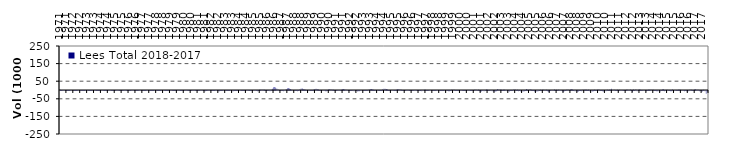
| Category | Lees Total 2018-2017 |
|---|---|
| 1971-01-31 23:59:00 | 2089.157 |
| 1971-02-28 23:59:00 | 69.414 |
| 1971-03-31 23:59:00 | 12.94 |
| 1971-04-30 23:59:00 | -39.855 |
| 1971-05-31 23:59:00 | -316.012 |
| 1971-06-30 23:59:00 | -532.731 |
| 1971-07-31 23:59:00 | -485.225 |
| 1971-08-31 23:59:00 | -167.346 |
| 1971-09-30 23:59:00 | -23.739 |
| 1971-10-31 23:59:00 | 181.066 |
| 1971-11-30 23:59:00 | 168.903 |
| 1971-12-31 23:59:00 | 235.752 |
| 1972-01-31 23:59:00 | 118.074 |
| 1972-02-29 23:59:00 | 70.713 |
| 1972-03-31 23:59:00 | 13.915 |
| 1972-04-30 23:59:00 | -31.402 |
| 1972-05-31 23:59:00 | -270.612 |
| 1972-06-30 23:59:00 | -466.446 |
| 1972-07-31 23:59:00 | -454.354 |
| 1972-08-31 23:59:00 | -190.957 |
| 1972-09-30 23:59:00 | -65.923 |
| 1972-10-31 23:59:00 | 187.51 |
| 1972-11-30 23:59:00 | 195.661 |
| 1972-12-31 23:59:00 | 262.358 |
| 1973-01-31 23:59:00 | 146.51 |
| 1973-02-28 23:59:00 | 106.974 |
| 1973-03-31 23:59:00 | 83.573 |
| 1973-04-30 23:59:00 | 36.99 |
| 1973-05-31 23:59:00 | -180.782 |
| 1973-06-30 23:59:00 | -282.298 |
| 1973-07-31 23:59:00 | -191.907 |
| 1973-08-31 23:59:00 | 78.103 |
| 1973-09-30 23:59:00 | 163.461 |
| 1973-10-31 23:59:00 | 299.173 |
| 1973-11-30 23:59:00 | 222.991 |
| 1973-12-31 23:59:00 | 274.464 |
| 1974-01-31 23:59:00 | 159.395 |
| 1974-02-28 23:59:00 | 113.206 |
| 1974-03-31 23:59:00 | 87.836 |
| 1974-04-30 23:59:00 | 62.555 |
| 1974-05-31 23:59:00 | -156.722 |
| 1974-06-30 23:59:00 | -355.595 |
| 1974-07-31 23:59:00 | -347.822 |
| 1974-08-31 23:59:00 | -19.925 |
| 1974-09-30 23:59:00 | 35.246 |
| 1974-10-31 23:59:00 | -126.607 |
| 1974-11-30 23:59:00 | -348.848 |
| 1974-12-31 23:59:00 | 62.664 |
| 1975-01-31 23:59:00 | 114.846 |
| 1975-02-28 23:59:00 | 67.077 |
| 1975-03-31 23:59:00 | 3.674 |
| 1975-04-30 23:59:00 | -67.404 |
| 1975-05-31 23:59:00 | -278.035 |
| 1975-06-30 23:59:00 | -310.409 |
| 1975-07-31 23:59:00 | -198.966 |
| 1975-08-31 23:59:00 | 73.88 |
| 1975-09-30 23:59:00 | 155.935 |
| 1975-10-31 23:59:00 | 287.997 |
| 1975-11-30 23:59:00 | 211.728 |
| 1975-12-31 23:59:00 | 270.113 |
| 1976-01-31 23:59:00 | 133.889 |
| 1976-02-29 23:59:00 | 107.571 |
| 1976-03-31 23:59:00 | 92.967 |
| 1976-04-30 23:59:00 | 92.132 |
| 1976-05-31 23:59:00 | -16.385 |
| 1976-06-30 23:59:00 | -68.67 |
| 1976-07-31 23:59:00 | -26.881 |
| 1976-08-31 23:59:00 | 126.55 |
| 1976-09-30 23:59:00 | 166.23 |
| 1976-10-31 23:59:00 | 177.496 |
| 1976-11-30 23:59:00 | 154.364 |
| 1976-12-31 23:59:00 | 211.756 |
| 1977-01-31 23:59:00 | 111.117 |
| 1977-02-28 23:59:00 | 69.444 |
| 1977-03-31 23:59:00 | -4.616 |
| 1977-04-30 23:59:00 | -77.29 |
| 1977-05-31 23:59:00 | -335.211 |
| 1977-06-30 23:59:00 | -490.312 |
| 1977-07-31 23:59:00 | -439.468 |
| 1977-08-31 23:59:00 | -134.497 |
| 1977-09-30 23:59:00 | 10.923 |
| 1977-10-31 23:59:00 | 196.837 |
| 1977-11-30 23:59:00 | 171.528 |
| 1977-12-31 23:59:00 | 236.837 |
| 1978-01-31 23:59:00 | 125.286 |
| 1978-02-28 23:59:00 | 78.055 |
| 1978-03-31 23:59:00 | -8.82 |
| 1978-04-30 23:59:00 | -92.59 |
| 1978-05-31 23:59:00 | -374.798 |
| 1978-06-30 23:59:00 | -551.161 |
| 1978-07-31 23:59:00 | -510.447 |
| 1978-08-31 23:59:00 | -168.956 |
| 1978-09-30 23:59:00 | 7.533 |
| 1978-10-31 23:59:00 | 221.023 |
| 1978-11-30 23:59:00 | 193.667 |
| 1978-12-31 23:59:00 | 266.343 |
| 1979-01-31 23:59:00 | 124.758 |
| 1979-02-28 23:59:00 | 76.872 |
| 1979-03-31 23:59:00 | -16.81 |
| 1979-04-30 23:59:00 | -101.989 |
| 1979-05-31 23:59:00 | -395.769 |
| 1979-06-30 23:59:00 | -589.679 |
| 1979-07-31 23:59:00 | -542.034 |
| 1979-08-31 23:59:00 | -181.796 |
| 1979-09-30 23:59:00 | -6.868 |
| 1979-10-31 23:59:00 | 219.444 |
| 1979-11-30 23:59:00 | 193.671 |
| 1979-12-31 23:59:00 | 270.023 |
| 1980-01-31 23:59:00 | 126.335 |
| 1980-02-29 23:59:00 | 74.662 |
| 1980-03-31 23:59:00 | -26.829 |
| 1980-04-30 23:59:00 | -128.727 |
| 1980-05-31 23:59:00 | -437.775 |
| 1980-06-30 23:59:00 | -646.565 |
| 1980-07-31 23:59:00 | -609.119 |
| 1980-08-31 23:59:00 | -238.246 |
| 1980-09-30 23:59:00 | -32.406 |
| 1980-10-31 23:59:00 | 218.53 |
| 1980-11-30 23:59:00 | 197.655 |
| 1980-12-31 23:59:00 | 281.475 |
| 1981-01-31 23:59:00 | 184.026 |
| 1981-02-28 23:59:00 | 106.43 |
| 1981-03-31 23:59:00 | -39.938 |
| 1981-04-30 23:59:00 | -185.8 |
| 1981-05-31 23:59:00 | -653.6 |
| 1981-06-30 23:59:00 | -950.418 |
| 1981-07-31 23:59:00 | -897.881 |
| 1981-08-31 23:59:00 | -357.765 |
| 1981-09-30 23:59:00 | -56.07 |
| 1981-10-31 23:59:00 | 309.607 |
| 1981-11-30 23:59:00 | 286.772 |
| 1981-12-31 23:59:00 | 406.084 |
| 1982-01-31 23:59:00 | 147.934 |
| 1982-02-28 23:59:00 | 86.748 |
| 1982-03-31 23:59:00 | -32.666 |
| 1982-04-30 23:59:00 | -141.352 |
| 1982-05-31 23:59:00 | -510.843 |
| 1982-06-30 23:59:00 | -742.988 |
| 1982-07-31 23:59:00 | -715.28 |
| 1982-08-31 23:59:00 | -282.612 |
| 1982-09-30 23:59:00 | -43.401 |
| 1982-10-31 23:59:00 | 252.735 |
| 1982-11-30 23:59:00 | 229.178 |
| 1982-12-31 23:59:00 | 326.612 |
| 1983-01-31 23:59:00 | 153.666 |
| 1983-02-28 23:59:00 | 80.655 |
| 1983-03-31 23:59:00 | -79.584 |
| 1983-04-30 23:59:00 | -236.319 |
| 1983-05-31 23:59:00 | -696.807 |
| 1983-06-30 23:59:00 | -922.134 |
| 1983-07-31 23:59:00 | -873.617 |
| 1983-08-31 23:59:00 | -405.871 |
| 1983-09-30 23:59:00 | -136.665 |
| 1983-10-31 23:59:00 | 236.969 |
| 1983-11-30 23:59:00 | 242.875 |
| 1983-12-31 23:59:00 | 362.956 |
| 1984-01-31 23:59:00 | 106.003 |
| 1984-02-29 23:59:00 | 13.698 |
| 1984-03-31 23:59:00 | -202.861 |
| 1984-04-30 23:59:00 | -366.604 |
| 1984-05-31 23:59:00 | -459.946 |
| 1984-06-30 23:59:00 | -105.835 |
| 1984-07-31 23:59:00 | 64.945 |
| 1984-08-31 23:59:00 | 404.602 |
| 1984-09-30 23:59:00 | 463.493 |
| 1984-10-31 23:59:00 | 469.117 |
| 1984-11-30 23:59:00 | 286.112 |
| 1984-12-31 23:59:00 | 365.694 |
| 1985-01-31 23:59:00 | -278.054 |
| 1985-02-28 23:59:00 | 99.672 |
| 1985-03-31 23:59:00 | -694.943 |
| 1985-04-30 23:59:00 | -926.61 |
| 1985-05-31 23:59:00 | -143.631 |
| 1985-06-30 23:59:00 | 1171.169 |
| 1985-07-31 23:59:00 | 1096.636 |
| 1985-08-31 23:59:00 | 1212.433 |
| 1985-09-30 23:59:00 | 1292.244 |
| 1985-10-31 23:59:00 | 851.708 |
| 1985-11-30 23:59:00 | 207.827 |
| 1985-12-31 23:59:00 | 257.168 |
| 1986-01-31 23:59:00 | -88.34 |
| 1986-02-28 23:59:00 | -253.645 |
| 1986-03-31 23:59:00 | -833.893 |
| 1986-04-30 23:59:00 | 1176.085 |
| 1986-05-31 23:59:00 | 7772.612 |
| 1986-06-30 23:59:00 | 15112.72 |
| 1986-07-31 23:59:00 | 17431.722 |
| 1986-08-31 23:59:00 | 13653.847 |
| 1986-09-30 23:59:00 | 8299.307 |
| 1986-10-31 23:59:00 | 2867.075 |
| 1986-11-30 23:59:00 | 216.052 |
| 1986-12-31 23:59:00 | 219.727 |
| 1987-01-31 23:59:00 | -85.781 |
| 1987-02-28 23:59:00 | -251.857 |
| 1987-03-31 23:59:00 | -798.282 |
| 1987-04-30 23:59:00 | 266.842 |
| 1987-05-31 23:59:00 | 5587.437 |
| 1987-06-30 23:59:00 | 10459.587 |
| 1987-07-31 23:59:00 | 11662.985 |
| 1987-08-31 23:59:00 | 8458.452 |
| 1987-09-30 23:59:00 | 5261.452 |
| 1987-10-31 23:59:00 | 1910.96 |
| 1987-11-30 23:59:00 | 170.891 |
| 1987-12-31 23:59:00 | 213.863 |
| 1988-01-31 23:59:00 | -82.226 |
| 1988-02-29 23:59:00 | -223.688 |
| 1988-03-31 23:59:00 | -808.194 |
| 1988-04-30 23:59:00 | -459.261 |
| 1988-05-31 23:59:00 | 3502.827 |
| 1988-06-30 23:59:00 | 7994.098 |
| 1988-07-31 23:59:00 | 8159.712 |
| 1988-08-31 23:59:00 | 4769.979 |
| 1988-09-30 23:59:00 | 3351.516 |
| 1988-10-31 23:59:00 | 941.836 |
| 1988-11-30 23:59:00 | 124.105 |
| 1988-12-31 23:59:00 | 203.03 |
| 1989-01-31 23:59:00 | -77.836 |
| 1989-02-28 23:59:00 | -195.859 |
| 1989-03-31 23:59:00 | -364.566 |
| 1989-04-30 23:59:00 | -403.468 |
| 1989-05-31 23:59:00 | 2014.231 |
| 1989-06-30 23:59:00 | 6232.221 |
| 1989-07-31 23:59:00 | 6543.43 |
| 1989-08-31 23:59:00 | 4924.879 |
| 1989-09-30 23:59:00 | 2718.47 |
| 1989-10-31 23:59:00 | -98.335 |
| 1989-11-30 23:59:00 | -43.96 |
| 1989-12-31 23:59:00 | 189.273 |
| 1990-01-31 23:59:00 | -77.526 |
| 1990-02-28 23:59:00 | -229.343 |
| 1990-03-31 23:59:00 | -864.209 |
| 1990-04-30 23:59:00 | -1175.335 |
| 1990-05-31 23:59:00 | 341.115 |
| 1990-06-30 23:59:00 | 3472.929 |
| 1990-07-31 23:59:00 | 4250.895 |
| 1990-08-31 23:59:00 | 2364.574 |
| 1990-09-30 23:59:00 | 798.349 |
| 1990-10-31 23:59:00 | 1475.907 |
| 1990-11-30 23:59:00 | 635.871 |
| 1990-12-31 23:59:00 | 681.773 |
| 1991-01-31 23:59:00 | 0.737 |
| 1991-02-28 23:59:00 | -289.559 |
| 1991-03-31 23:59:00 | -444.086 |
| 1991-04-30 23:59:00 | -284.109 |
| 1991-05-31 23:59:00 | 1664.059 |
| 1991-06-30 23:59:00 | 4858.534 |
| 1991-07-31 23:59:00 | 5156.425 |
| 1991-08-31 23:59:00 | 3301.65 |
| 1991-09-30 23:59:00 | 1391.368 |
| 1991-10-31 23:59:00 | 296.994 |
| 1991-11-30 23:59:00 | -233.953 |
| 1991-12-31 23:59:00 | -274.01 |
| 1992-01-31 23:59:00 | 1.159 |
| 1992-02-29 23:59:00 | -290.321 |
| 1992-03-31 23:59:00 | -523.843 |
| 1992-04-30 23:59:00 | -1152.907 |
| 1992-05-31 23:59:00 | -1775.897 |
| 1992-06-30 23:59:00 | -319.891 |
| 1992-07-31 23:59:00 | -2377.668 |
| 1992-08-31 23:59:00 | -825.717 |
| 1992-09-30 23:59:00 | -1479.125 |
| 1992-10-31 23:59:00 | -622.372 |
| 1992-11-30 23:59:00 | -268.374 |
| 1992-12-31 23:59:00 | -273.307 |
| 1993-01-31 23:59:00 | 0.412 |
| 1993-02-28 23:59:00 | -290.965 |
| 1993-03-31 23:59:00 | -433.84 |
| 1993-04-30 23:59:00 | -191.071 |
| 1993-05-31 23:59:00 | 1994.606 |
| 1993-06-30 23:59:00 | 5253.588 |
| 1993-07-31 23:59:00 | 5583.048 |
| 1993-08-31 23:59:00 | 3532.21 |
| 1993-09-30 23:59:00 | 1434.25 |
| 1993-10-31 23:59:00 | 282.366 |
| 1993-11-30 23:59:00 | -236.245 |
| 1993-12-31 23:59:00 | -273.602 |
| 1994-01-31 23:59:00 | 2.041 |
| 1994-02-28 23:59:00 | -291.167 |
| 1994-03-31 23:59:00 | -413.024 |
| 1994-04-30 23:59:00 | 154.517 |
| 1994-05-31 23:59:00 | 3301.341 |
| 1994-06-30 23:59:00 | 7163.066 |
| 1994-07-31 23:59:00 | 7686.983 |
| 1994-08-31 23:59:00 | 5029.92 |
| 1994-09-30 23:59:00 | 2385.414 |
| 1994-10-31 23:59:00 | 589.604 |
| 1994-11-30 23:59:00 | -222.126 |
| 1994-12-31 23:59:00 | -274.516 |
| 1995-01-31 23:59:00 | 1.573 |
| 1995-02-28 23:59:00 | -289.543 |
| 1995-03-31 23:59:00 | -439.923 |
| 1995-04-30 23:59:00 | -196.776 |
| 1995-05-31 23:59:00 | 1702.256 |
| 1995-06-30 23:59:00 | 4659.212 |
| 1995-07-31 23:59:00 | 4824.874 |
| 1995-08-31 23:59:00 | 2293.165 |
| 1995-09-30 23:59:00 | 1014.479 |
| 1995-10-31 23:59:00 | 10.456 |
| 1995-11-30 23:59:00 | -93.682 |
| 1995-12-31 23:59:00 | -95.429 |
| 1996-01-31 23:59:00 | -1.098 |
| 1996-02-29 23:59:00 | 0.064 |
| 1996-03-31 23:59:00 | 1.391 |
| 1996-04-30 23:59:00 | 0.039 |
| 1996-05-31 23:59:00 | -0.423 |
| 1996-06-30 23:59:00 | -0.046 |
| 1996-07-31 23:59:00 | 0.059 |
| 1996-08-31 23:59:00 | -0.077 |
| 1996-09-30 23:59:00 | -1.444 |
| 1996-10-31 23:59:00 | -91.05 |
| 1996-11-30 23:59:00 | -552.331 |
| 1996-12-31 23:59:00 | -606.856 |
| 1997-01-31 23:59:00 | -635.717 |
| 1997-02-28 23:59:00 | -695.443 |
| 1997-03-31 23:59:00 | -789.654 |
| 1997-04-30 23:59:00 | -403.357 |
| 1997-05-31 23:59:00 | 1108.322 |
| 1997-06-30 23:59:00 | 1684.653 |
| 1997-07-31 23:59:00 | 49.725 |
| 1997-08-31 23:59:00 | 573.098 |
| 1997-09-30 23:59:00 | 637.605 |
| 1997-10-31 23:59:00 | 11.491 |
| 1997-11-30 23:59:00 | -1.082 |
| 1997-12-31 23:59:00 | -0.372 |
| 1998-01-31 23:59:00 | 1.815 |
| 1998-02-28 23:59:00 | -0.335 |
| 1998-03-31 23:59:00 | -1.407 |
| 1998-04-30 23:59:00 | 1.798 |
| 1998-05-31 23:59:00 | -1.585 |
| 1998-06-30 23:59:00 | 0.005 |
| 1998-07-31 23:59:00 | 1.501 |
| 1998-08-31 23:59:00 | 0.078 |
| 1998-09-30 23:59:00 | -0.422 |
| 1998-10-31 23:59:00 | -1.215 |
| 1998-11-30 23:59:00 | -615.307 |
| 1998-12-31 23:59:00 | -665.468 |
| 1999-01-31 23:59:00 | -691.098 |
| 1999-02-28 23:59:00 | -753.25 |
| 1999-03-31 23:59:00 | -841.92 |
| 1999-04-30 23:59:00 | -24.627 |
| 1999-05-31 23:59:00 | 1145.539 |
| 1999-06-30 23:59:00 | 1686.082 |
| 1999-07-31 23:59:00 | 1098.078 |
| 1999-08-31 23:59:00 | 572.092 |
| 1999-09-30 23:59:00 | 18.458 |
| 1999-10-31 23:59:00 | 0.029 |
| 1999-11-30 23:59:00 | 0.108 |
| 1999-12-31 23:59:00 | -0.032 |
| 2000-01-31 23:59:00 | 1.923 |
| 2000-02-29 23:59:00 | -1.44 |
| 2000-03-31 23:59:00 | 1.051 |
| 2000-04-30 23:59:00 | 0.346 |
| 2000-05-31 23:59:00 | -1.464 |
| 2000-06-30 23:59:00 | 1.507 |
| 2000-07-31 23:59:00 | -1.922 |
| 2000-08-31 23:59:00 | 0.09 |
| 2000-09-30 23:59:00 | 0.019 |
| 2000-10-31 23:59:00 | 189.439 |
| 2000-11-30 23:59:00 | -177.407 |
| 2000-12-31 23:59:00 | -10.592 |
| 2001-01-31 | 1221.363 |
| 2001-02-28 | 1449.55 |
| 2001-03-31 | 521.328 |
| 2001-04-30 | 1725.754 |
| 2001-05-31 | -1586.78 |
| 2001-06-30 | -4661.706 |
| 2001-07-31 | -2426.893 |
| 2001-08-31 | 478.026 |
| 2001-09-30 | -1955.243 |
| 2001-10-31 | -437.558 |
| 2001-11-30 | 2715.346 |
| 2001-12-31 | 1955.324 |
| 2002-01-31 | -88.906 |
| 2002-02-28 | -570.783 |
| 2002-03-31 | 176.928 |
| 2002-04-30 | -763.754 |
| 2002-05-31 | -2852.07 |
| 2002-06-30 | -3547.146 |
| 2002-07-31 | -2275.49 |
| 2002-08-31 | -840.519 |
| 2002-09-30 | 4992.813 |
| 2002-10-31 | 1888.577 |
| 2002-11-30 | 2207.286 |
| 2002-12-31 | 1672.903 |
| 2003-01-31 | -164.186 |
| 2003-02-28 | 1532.895 |
| 2003-03-31 | 937.609 |
| 2003-04-30 | -693.448 |
| 2003-05-31 | -1842.984 |
| 2003-06-30 | -1507.449 |
| 2003-07-31 | -3013.463 |
| 2003-08-31 | 36.047 |
| 2003-09-30 | -537.88 |
| 2003-10-31 | -677.215 |
| 2003-11-30 | 2448.794 |
| 2003-12-31 | 2783.613 |
| 2004-01-31 | 203.312 |
| 2004-02-29 | 1187.961 |
| 2004-03-31 | -1340.505 |
| 2004-04-30 | -26.865 |
| 2004-05-31 | -3312.495 |
| 2004-06-30 | -3311.404 |
| 2004-07-31 | -2331.622 |
| 2004-08-31 | -714.751 |
| 2004-09-30 | 452.749 |
| 2004-10-31 | 4983.073 |
| 2004-11-30 | 1450.495 |
| 2004-12-31 | 1575.491 |
| 2005-01-31 | 4312.676 |
| 2005-02-28 | 1486.689 |
| 2005-03-31 | 677.678 |
| 2005-04-30 | -691.013 |
| 2005-05-31 | -2212.566 |
| 2005-06-30 | -3512.994 |
| 2005-07-31 | -4147.204 |
| 2005-08-31 | -722.837 |
| 2005-09-30 | 447.537 |
| 2005-10-31 | 740.911 |
| 2005-11-30 | 334.649 |
| 2005-12-31 | 1985.898 |
| 2006-01-31 | 1493.139 |
| 2006-02-28 | -303.632 |
| 2006-03-31 | 1945.531 |
| 2006-04-30 | -1405.089 |
| 2006-05-31 | -3598.047 |
| 2006-06-30 | -4497.76 |
| 2006-07-31 | 226.5 |
| 2006-08-31 | 463.849 |
| 2006-09-30 | 305.585 |
| 2006-10-31 | 3341.227 |
| 2006-11-30 | 512.875 |
| 2006-12-31 | 1128.187 |
| 2007-01-31 | 355.534 |
| 2007-02-28 | 1398.259 |
| 2007-03-31 | -246.956 |
| 2007-04-30 | -612.121 |
| 2007-05-31 | -2298.733 |
| 2007-06-30 | -4657.884 |
| 2007-07-31 | -1791.839 |
| 2007-08-31 | 327.744 |
| 2007-09-30 | 1934.565 |
| 2007-10-31 | 951.427 |
| 2007-11-30 | -346.376 |
| 2007-12-31 | 2189.567 |
| 2008-01-31 | 4299.521 |
| 2008-02-29 | 3339.735 |
| 2008-03-31 | -108.184 |
| 2008-04-30 | -1809.147 |
| 2008-05-31 | -1752.695 |
| 2008-06-30 | -3841.591 |
| 2008-07-31 | -2277.894 |
| 2008-08-31 | -327.792 |
| 2008-09-30 | -171.64 |
| 2008-10-31 | -715.565 |
| 2008-11-30 | 1123.481 |
| 2008-12-31 | 2109.507 |
| 2009-01-31 | 1744.971 |
| 2009-02-28 | 1099.706 |
| 2009-03-31 | -361.126 |
| 2009-04-30 | 839.838 |
| 2009-05-31 | -1931.215 |
| 2009-06-30 | -1371.093 |
| 2009-07-31 | -2380.788 |
| 2009-08-31 | -1463.341 |
| 2009-09-30 | 1354.63 |
| 2009-10-31 | 144.591 |
| 2009-11-30 | -410.078 |
| 2009-12-31 | 2340.948 |
| 2010-01-31 | 1459.03 |
| 2010-02-28 | -116.625 |
| 2010-03-31 | -403.619 |
| 2010-04-30 | -1773.481 |
| 2010-05-31 | -2469.491 |
| 2010-06-30 | -1821.926 |
| 2010-07-31 | -1262.851 |
| 2010-08-31 | 1143.047 |
| 2010-09-30 | -675.023 |
| 2010-10-31 | 2054.666 |
| 2010-11-30 | 787.502 |
| 2010-12-31 | 7481.005 |
| 2011-01-31 | 292.602 |
| 2011-02-28 | 1702.955 |
| 2011-03-31 | -543.748 |
| 2011-04-30 | 99.4 |
| 2011-05-31 | 1899.33 |
| 2011-06-30 | -2599.326 |
| 2011-07-31 | 1623.128 |
| 2011-08-31 | -557.31 |
| 2011-09-30 | -139.513 |
| 2011-10-31 | 404.06 |
| 2011-11-30 | 532.289 |
| 2011-12-31 | 690.351 |
| 2012-01-31 | 1915.53 |
| 2012-02-29 | 1806.08 |
| 2012-03-31 | 275.89 |
| 2012-04-30 | 2949.349 |
| 2012-05-31 | 343.393 |
| 2012-06-30 | -6296.302 |
| 2012-07-31 | 2324.491 |
| 2012-08-31 | -444.721 |
| 2012-09-30 | 2685.431 |
| 2012-10-31 | -823.575 |
| 2012-11-30 | 1386.943 |
| 2012-12-31 | 3193.509 |
| 2013-01-31 | 861.54 |
| 2013-02-28 | -278.172 |
| 2013-03-31 | -250.585 |
| 2013-04-30 | -625.136 |
| 2013-05-31 | -250.191 |
| 2013-06-30 | -1201.87 |
| 2013-07-31 | -168.323 |
| 2013-08-31 | 911.963 |
| 2013-09-30 | 1101.277 |
| 2013-10-31 | 989.15 |
| 2013-11-30 | 781.903 |
| 2013-12-31 | 1518.781 |
| 2014-01-31 | -93.111 |
| 2014-02-28 | 60.239 |
| 2014-03-31 | -810.68 |
| 2014-04-30 | -1609.135 |
| 2014-05-31 | -983.188 |
| 2014-06-30 | -2862.773 |
| 2014-07-31 | -627.504 |
| 2014-08-31 | 2771.311 |
| 2014-09-30 | 3659.736 |
| 2014-10-31 | -808.917 |
| 2014-11-30 | 237.5 |
| 2014-12-31 | 1203.474 |
| 2015-01-31 | 668.266 |
| 2015-02-28 | 26.705 |
| 2015-03-31 | -916.602 |
| 2015-04-30 | -1777.49 |
| 2015-05-31 | 2559.682 |
| 2015-06-30 | -2068.901 |
| 2015-07-31 | -111.891 |
| 2015-08-31 | 565.404 |
| 2015-09-30 | -10.471 |
| 2015-10-31 | 1026.301 |
| 2015-11-30 | 804.732 |
| 2015-12-31 | 1219.738 |
| 2016-01-31 | 581.679 |
| 2016-02-29 | -207.935 |
| 2016-03-31 | -867.266 |
| 2016-04-30 | -479.715 |
| 2016-05-31 | -727.418 |
| 2016-06-30 | -2797.748 |
| 2016-07-31 | -1241.339 |
| 2016-08-31 | 717.792 |
| 2016-09-30 | 2120.788 |
| 2016-10-31 | -492.406 |
| 2016-11-30 | 544.084 |
| 2016-12-31 | 2425.532 |
| 2017-01-31 | 4025.801 |
| 2017-02-28 | 1180.011 |
| 2017-03-31 | 1040.73 |
| 2017-04-30 | -786.561 |
| 2017-05-31 | -601.214 |
| 2017-06-30 | -3516.226 |
| 2017-07-31 | -3096.084 |
| 2017-08-31 | 1981.385 |
| 2017-09-30 | -796.257 |
| 2017-10-31 | -15787.308 |
| 2017-11-30 | -4168.98 |
| 2017-12-31 | -20515.363 |